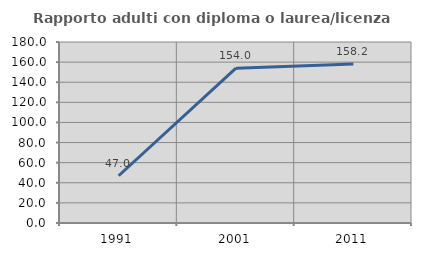
| Category | Rapporto adulti con diploma o laurea/licenza media  |
|---|---|
| 1991.0 | 46.97 |
| 2001.0 | 153.968 |
| 2011.0 | 158.228 |